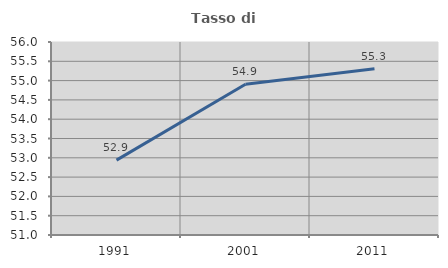
| Category | Tasso di occupazione   |
|---|---|
| 1991.0 | 52.939 |
| 2001.0 | 54.904 |
| 2011.0 | 55.307 |